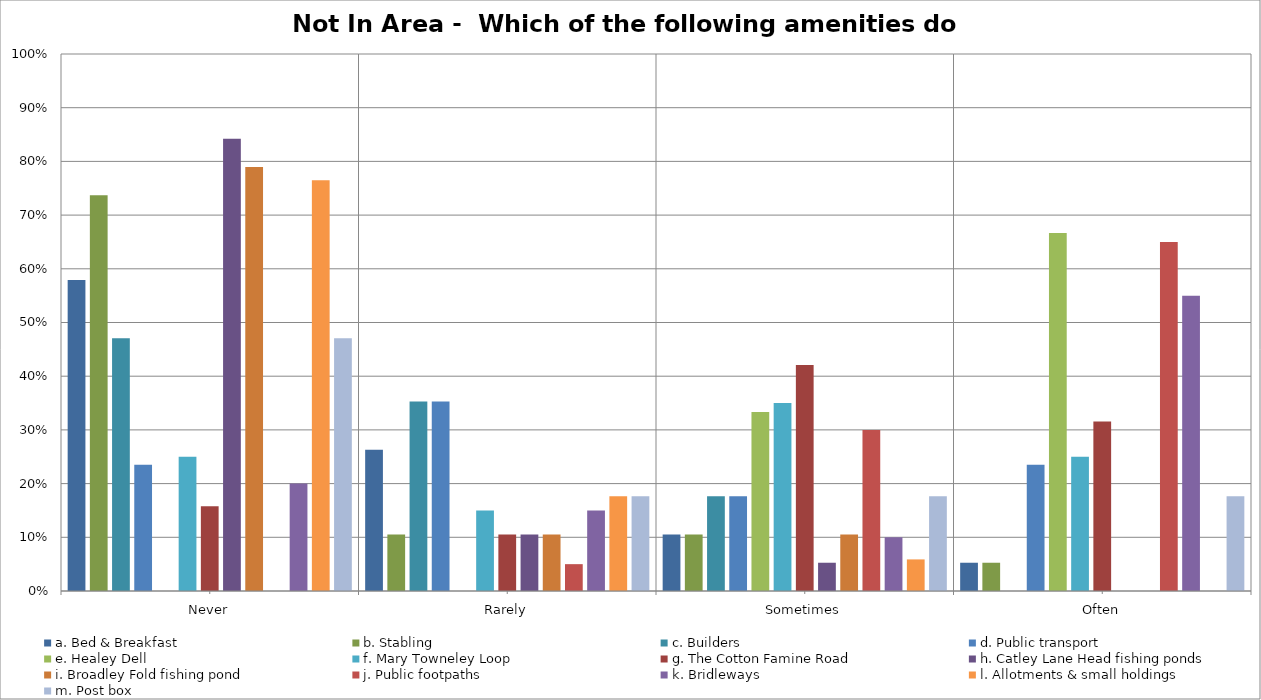
| Category | a. Bed & Breakfast | b. Stabling | c. Builders | d. Public transport | e. Healey Dell | f. Mary Towneley Loop | g. The Cotton Famine Road | h. Catley Lane Head fishing ponds | i. Broadley Fold fishing pond | j. Public footpaths | k. Bridleways | l. Allotments & small holdings | m. Post box |
|---|---|---|---|---|---|---|---|---|---|---|---|---|---|
| Never | 0.579 | 0.737 | 0.471 | 0.235 | 0 | 0.25 | 0.158 | 0.842 | 0.789 | 0 | 0.2 | 0.765 | 0.471 |
| Rarely | 0.263 | 0.105 | 0.353 | 0.353 | 0 | 0.15 | 0.105 | 0.105 | 0.105 | 0.05 | 0.15 | 0.176 | 0.176 |
| Sometimes | 0.105 | 0.105 | 0.176 | 0.176 | 0.333 | 0.35 | 0.421 | 0.053 | 0.105 | 0.3 | 0.1 | 0.059 | 0.176 |
| Often | 0.053 | 0.053 | 0 | 0.235 | 0.667 | 0.25 | 0.316 | 0 | 0 | 0.65 | 0.55 | 0 | 0.176 |